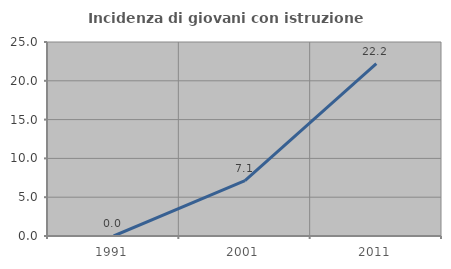
| Category | Incidenza di giovani con istruzione universitaria |
|---|---|
| 1991.0 | 0 |
| 2001.0 | 7.143 |
| 2011.0 | 22.222 |